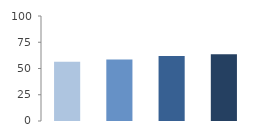
| Category | Rate (%) |
|---|---|
| 2009.0 | 56.45 |
| 2010.0 | 58.47 |
| 2011.0 | 61.82 |
| 2012.0 | 63.513 |